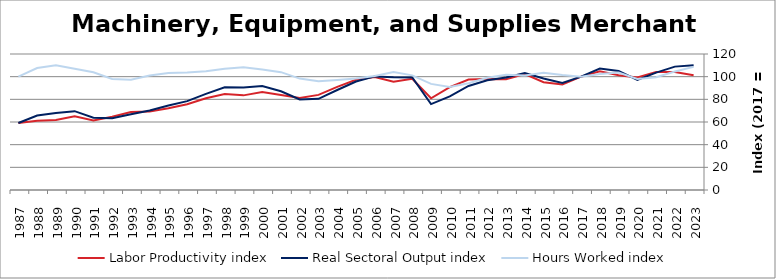
| Category | Labor Productivity index | Real Sectoral Output index | Hours Worked index |
|---|---|---|---|
| 2023.0 | 101.241 | 109.977 | 108.628 |
| 2022.0 | 104.094 | 108.864 | 104.582 |
| 2021.0 | 104.053 | 103.581 | 99.546 |
| 2020.0 | 99.209 | 97.197 | 97.972 |
| 2019.0 | 101.335 | 105.099 | 103.715 |
| 2018.0 | 104.718 | 107.225 | 102.394 |
| 2017.0 | 100 | 100 | 100 |
| 2016.0 | 93.182 | 94.524 | 101.439 |
| 2015.0 | 95.154 | 98.418 | 103.43 |
| 2014.0 | 102.285 | 103.296 | 100.988 |
| 2013.0 | 97.648 | 99.208 | 101.598 |
| 2012.0 | 97.878 | 96.902 | 99.003 |
| 2011.0 | 97.432 | 91.767 | 94.186 |
| 2010.0 | 90.754 | 82.572 | 90.984 |
| 2009.0 | 80.933 | 75.775 | 93.626 |
| 2008.0 | 98.122 | 99.257 | 101.157 |
| 2007.0 | 95.578 | 99.426 | 104.026 |
| 2006.0 | 99.613 | 100.242 | 100.631 |
| 2005.0 | 97.267 | 95.731 | 98.421 |
| 2004.0 | 91.03 | 88.26 | 96.956 |
| 2003.0 | 83.914 | 80.438 | 95.858 |
| 2002.0 | 81.251 | 79.878 | 98.309 |
| 2001.0 | 83.828 | 87.148 | 103.961 |
| 2000.0 | 86.365 | 91.813 | 106.308 |
| 1999.0 | 83.499 | 90.511 | 108.397 |
| 1998.0 | 84.622 | 90.616 | 107.083 |
| 1997.0 | 81.016 | 84.836 | 104.715 |
| 1996.0 | 75.694 | 78.423 | 103.605 |
| 1995.0 | 72.163 | 74.517 | 103.263 |
| 1994.0 | 69.333 | 70.076 | 101.071 |
| 1993.0 | 68.797 | 66.911 | 97.259 |
| 1992.0 | 64.644 | 63.316 | 97.946 |
| 1991.0 | 61.437 | 63.811 | 103.864 |
| 1990.0 | 64.975 | 69.573 | 107.076 |
| 1989.0 | 61.757 | 67.996 | 110.101 |
| 1988.0 | 61.116 | 65.765 | 107.607 |
| 1987.0 | 59.051 | 59.076 | 100.042 |